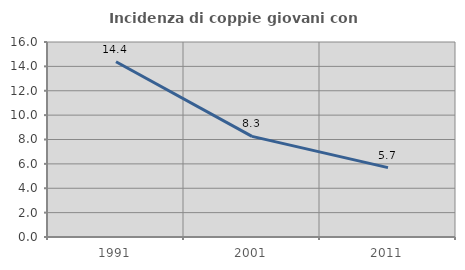
| Category | Incidenza di coppie giovani con figli |
|---|---|
| 1991.0 | 14.38 |
| 2001.0 | 8.255 |
| 2011.0 | 5.694 |